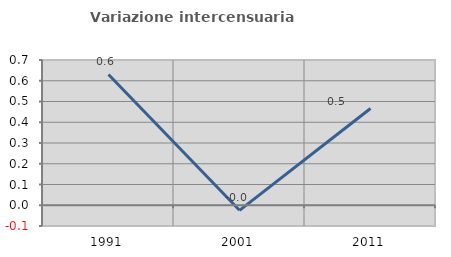
| Category | Variazione intercensuaria annua |
|---|---|
| 1991.0 | 0.63 |
| 2001.0 | -0.024 |
| 2011.0 | 0.466 |